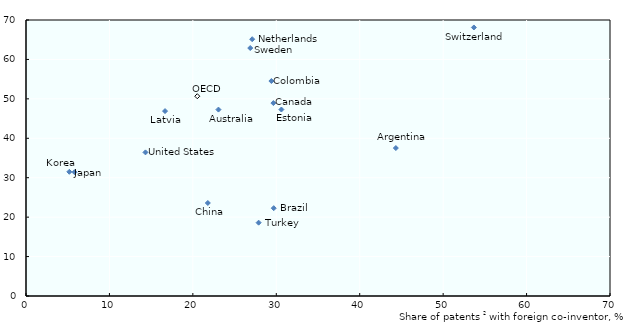
| Category | Share of publications1 with foreign co-author, % |
|---|---|
| 23.0672532998114 | 47.278 |
| 29.695885509839 | 22.273 |
| 29.6519123334766 | 48.93 |
| 21.7936036927135 | 23.59 |
| 29.4117647058824 | 54.523 |
| 30.6122448979592 | 47.295 |
| 5.19236196030477 | 31.5 |
| 5.81277458600879 | 31.397 |
| 16.6666666666667 | 46.9 |
| 27.1135940409683 | 65.128 |
| 26.8788682581786 | 62.893 |
| 53.6836935166994 | 68.107 |
| 27.8846153846154 | 18.6 |
| 14.3183549124143 | 36.423 |
| 20.529255219461 | 50.665 |
| 44.3298969072165 | 37.522 |